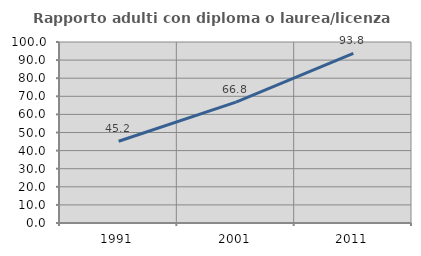
| Category | Rapporto adulti con diploma o laurea/licenza media  |
|---|---|
| 1991.0 | 45.161 |
| 2001.0 | 66.818 |
| 2011.0 | 93.773 |